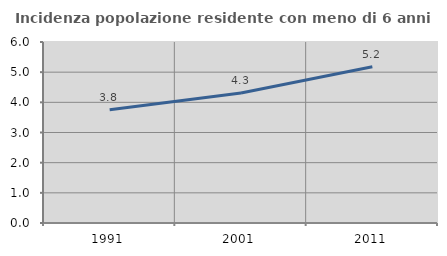
| Category | Incidenza popolazione residente con meno di 6 anni |
|---|---|
| 1991.0 | 3.752 |
| 2001.0 | 4.31 |
| 2011.0 | 5.177 |